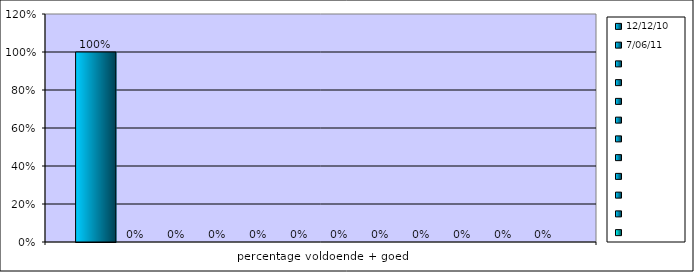
| Category | 12-12-10 | 7-06-11 | Series 2 | Series 3 | Series 4 | Series 5 | Series 6 | Series 7 | Series 8 | Series 9 | Series 10 | Series 11 |
|---|---|---|---|---|---|---|---|---|---|---|---|---|
| percentage voldoende + goed | 1 | 0 | 0 | 0 | 0 | 0 | 0 | 0 | 0 | 0 | 0 | 0 |